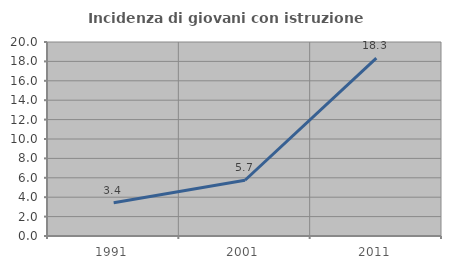
| Category | Incidenza di giovani con istruzione universitaria |
|---|---|
| 1991.0 | 3.419 |
| 2001.0 | 5.747 |
| 2011.0 | 18.333 |